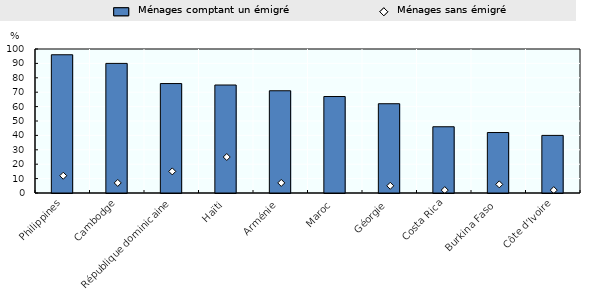
| Category | Ménages comptant un émigré |
|---|---|
| Philippines | 96 |
| Cambodge | 90 |
| République dominicaine | 76 |
| Haïti | 75 |
| Arménie | 71 |
| Maroc | 67 |
| Géorgie | 62 |
| Costa Rica | 46 |
| Burkina Faso | 42 |
| Côte d’Ivoire | 40 |